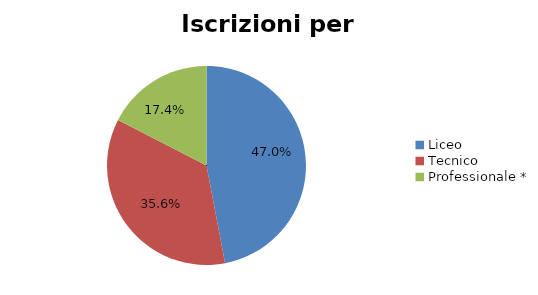
| Category | Series 0 |
|---|---|
| Liceo  | 17839 |
| Tecnico | 13492 |
| Professionale * | 6619 |